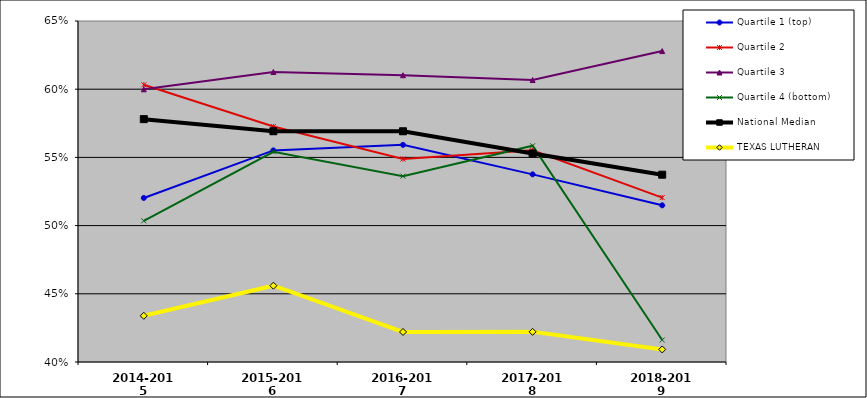
| Category | Quartile 1 (top) | Quartile 2 | Quartile 3 | Quartile 4 (bottom) | National Median | TEXAS LUTHERAN |
|---|---|---|---|---|---|---|
| 2014-2015 | 0.52 | 0.603 | 0.6 | 0.504 | 0.578 | 0.434 |
| 2015-2016 | 0.555 | 0.573 | 0.613 | 0.554 | 0.569 | 0.456 |
| 2016-2017 | 0.559 | 0.549 | 0.61 | 0.536 | 0.569 | 0.422 |
| 2017-2018 | 0.538 | 0.555 | 0.607 | 0.559 | 0.553 | 0.422 |
| 2018-2019 | 0.515 | 0.521 | 0.628 | 0.416 | 0.537 | 0.409 |